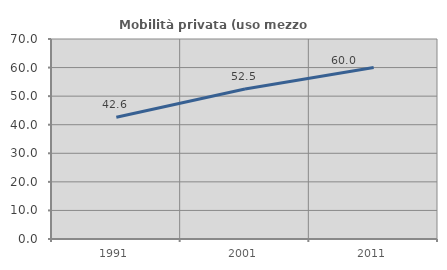
| Category | Mobilità privata (uso mezzo privato) |
|---|---|
| 1991.0 | 42.629 |
| 2001.0 | 52.511 |
| 2011.0 | 60 |